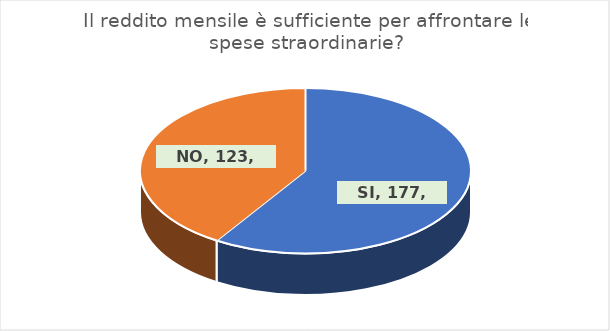
| Category | Series 0 |
|---|---|
| SI | 177 |
| NO | 123 |